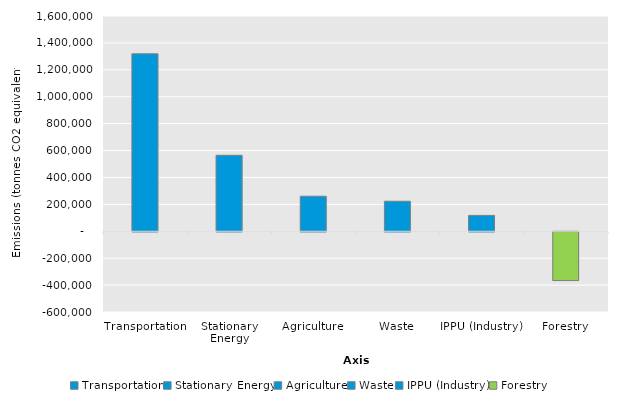
| Category | 2017 |
|---|---|
| Transportation | 1318889 |
| Stationary Energy | 564908 |
| Agriculture | 260309 |
| Waste | 223244 |
| IPPU (Industry) | 117985 |
| Forestry | -362679 |